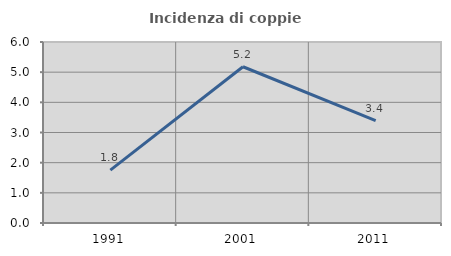
| Category | Incidenza di coppie miste |
|---|---|
| 1991.0 | 1.754 |
| 2001.0 | 5.179 |
| 2011.0 | 3.396 |